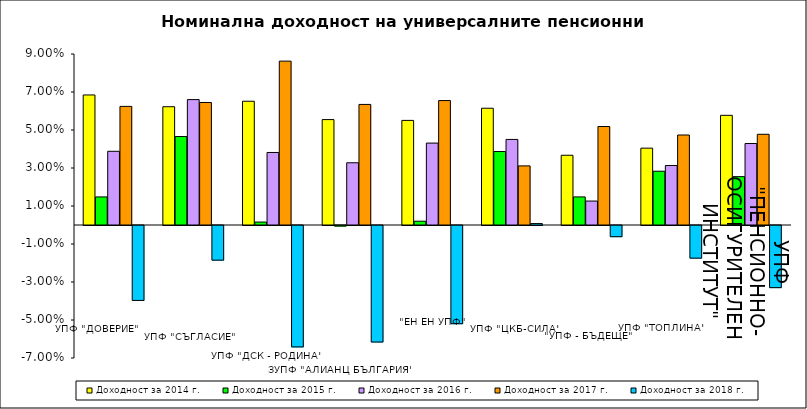
| Category | Доходност за 2014 г. | Доходност за 2015 г. | Доходност за 2016 г. | Доходност за 2017 г. | Доходност за 2018 г. |
|---|---|---|---|---|---|
| УПФ "ДОВЕРИЕ"  | 0.068 | 0.015 | 0.039 | 0.062 | -0.039 |
| УПФ "СЪГЛАСИЕ" | 0.062 | 0.047 | 0.066 | 0.064 | -0.018 |
| УПФ "ДСК - РОДИНА" | 0.065 | 0.002 | 0.038 | 0.086 | -0.064 |
| ЗУПФ "АЛИАНЦ БЪЛГАРИЯ" | 0.055 | 0 | 0.033 | 0.063 | -0.061 |
| "ЕН ЕН УПФ" | 0.055 | 0.002 | 0.043 | 0.065 | -0.052 |
| УПФ "ЦКБ-СИЛА" | 0.061 | 0.039 | 0.045 | 0.031 | 0.001 |
| "УПФ - БЪДЕЩЕ" | 0.037 | 0.015 | 0.013 | 0.052 | -0.006 |
| УПФ "ТОПЛИНА" | 0.04 | 0.028 | 0.031 | 0.047 | -0.017 |
| УПФ "ПЕНСИОННООСИГУРИТЕЛЕН ИНСТИТУТ" | 0.058 | 0.025 | 0.043 | 0.048 | -0.033 |